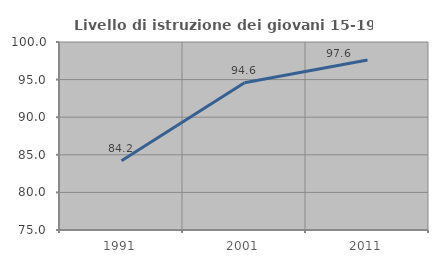
| Category | Livello di istruzione dei giovani 15-19 anni |
|---|---|
| 1991.0 | 84.222 |
| 2001.0 | 94.593 |
| 2011.0 | 97.604 |